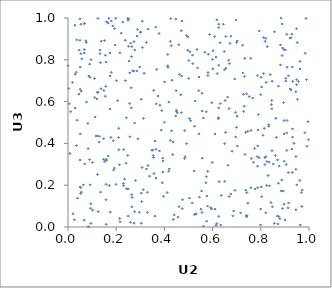
| Category | Series 0 |
|---|---|
| 0.13522444000613 | 0.167 |
| 0.7854953236132686 | 0.337 |
| 0.39144185761630057 | 0.211 |
| 0.0030037911882846435 | 0.664 |
| 0.0006992588423483381 | 0.772 |
| 0.6928218439673285 | 0.175 |
| 0.8116280989693601 | 0.907 |
| 0.5570533439098767 | 0.329 |
| 0.702722443580721 | 0.388 |
| 0.8464168371500842 | 0.365 |
| 0.8731145959814042 | 0.209 |
| 0.46050105868576596 | 0.097 |
| 0.3609877343468043 | 0.052 |
| 0.6637430186142336 | 0.295 |
| 0.1199688120044361 | 0.613 |
| 0.3796724315625547 | 0.364 |
| 0.4836005883754283 | 0.327 |
| 0.12109681325410748 | 0.436 |
| 0.19325541087583087 | 0.949 |
| 0.40074470990659805 | 0.694 |
| 0.2098115138034229 | 0.429 |
| 0.9314464640888953 | 0.469 |
| 0.30590182833435553 | 0.122 |
| 0.9040351437162205 | 0.711 |
| 0.44763936766492873 | 0.994 |
| 0.6875140807885057 | 0.076 |
| 0.5741635742791101 | 0.241 |
| 0.8222397956273461 | 0.692 |
| 0.171328026896286 | 0.198 |
| 0.9293196318778789 | 0.373 |
| 0.1349155145619143 | 0.786 |
| 0.36530642596375495 | 0.234 |
| 0.23790195415000726 | 0.894 |
| 0.25212200026847653 | 0.996 |
| 0.5798443758908589 | 0.266 |
| 0.6951840031433745 | 0.549 |
| 0.5044113145965674 | 0.519 |
| 0.1592360092771371 | 0.319 |
| 0.6759639606240546 | 0.913 |
| 0.09488207329281606 | 0.017 |
| 0.15767371093581373 | 0.131 |
| 0.7935874388112831 | 0.938 |
| 0.4178026478703567 | 0.267 |
| 0.7519551576580974 | 0.624 |
| 0.7333554290966594 | 0.807 |
| 0.3383820969892326 | 0.243 |
| 0.15204265226465674 | 0.892 |
| 0.15488302051557734 | 0.626 |
| 0.1757499536681525 | 0.071 |
| 0.1293714959015827 | 0.406 |
| 0.6235103307099706 | 0.523 |
| 0.9459014373322512 | 0.082 |
| 0.5238356277748918 | 0.268 |
| 0.2637597680489733 | 0.815 |
| 0.03521423334990137 | 0.39 |
| 0.4970654676559536 | 0.846 |
| 0.8847473076907165 | 0.173 |
| 0.23118691189806995 | 0.37 |
| 0.7694178278699199 | 0.31 |
| 0.08970082993973405 | 0.779 |
| 0.050657194036684006 | 0.321 |
| 0.21388986283033562 | 0.298 |
| 0.9518093916620322 | 0.611 |
| 0.7592072113374451 | 0.462 |
| 0.8168345488895357 | 0.299 |
| 0.0916192597671539 | 0.716 |
| 0.8478326386551936 | 0.097 |
| 0.619409901828192 | 0.734 |
| 0.46778476510446043 | 0.633 |
| 0.7609992667190348 | 0.328 |
| 0.2770071526737993 | 0.847 |
| 0.05085086431300845 | 0.446 |
| 0.15156551885196712 | 0.314 |
| 0.9484926936673921 | 0.705 |
| 0.6538824156324461 | 0.453 |
| 0.15668550616737276 | 0.673 |
| 0.633797178534416 | 0.01 |
| 0.2480532186995542 | 0.343 |
| 0.2971117360714476 | 0.765 |
| 0.625386536282283 | 0.774 |
| 0.5378776261457467 | 0.761 |
| 0.24979716889605386 | 0.182 |
| 0.5244565401779293 | 0.06 |
| 0.018469823262137197 | 0.691 |
| 0.26215881002402897 | 0.666 |
| 0.6998794230425606 | 0.882 |
| 0.05305428043056115 | 0.189 |
| 0.9090511494608593 | 0.764 |
| 0.2766044941676715 | 0.497 |
| 0.23827444743194215 | 0.7 |
| 0.516704916468129 | 0.822 |
| 0.8930575406515036 | 0.172 |
| 0.7869872466771587 | 0.188 |
| 0.6087335224024885 | 0.911 |
| 0.8240632570763873 | 0.199 |
| 0.41414093554436815 | 0.826 |
| 0.2803002887323688 | 0.223 |
| 0.6693167705677958 | 0.782 |
| 0.9318446246234737 | 0.43 |
| 0.7281287988434613 | 0.635 |
| 0.19782121869917346 | 0.998 |
| 0.8459723187522573 | 0.566 |
| 0.7418130182028247 | 0.049 |
| 0.17971278921391054 | 0.74 |
| 0.4624405466307594 | 0.731 |
| 0.8469820346900373 | 0.697 |
| 0.724636669125003 | 0.87 |
| 0.23470227509630814 | 0.229 |
| 0.3258224575851033 | 0.278 |
| 0.4701891874599856 | 0.939 |
| 0.9453580634695868 | 0.647 |
| 0.6021198923142702 | 0.843 |
| 0.8790433075222467 | 0.039 |
| 0.42531058107387953 | 0.414 |
| 0.6311084041201827 | 0.881 |
| 0.734315081193149 | 0.347 |
| 0.011396953292470924 | 0.552 |
| 0.5039792126516335 | 0.138 |
| 0.18912776371298645 | 0.272 |
| 0.9980852966514765 | 0.418 |
| 0.948058557039052 | 0.949 |
| 0.2740830115219759 | 0.887 |
| 0.15522935036928076 | 0.822 |
| 0.9873932327040216 | 0.998 |
| 0.6251059547572199 | 0.57 |
| 0.8764194119545408 | 0.291 |
| 0.4135466784617414 | 0.771 |
| 0.06376235207848313 | 0.202 |
| 0.5965068068085876 | 0.595 |
| 0.21062224396404938 | 0.472 |
| 0.0863100522165795 | 0.723 |
| 0.12535734493258033 | 0.645 |
| 0.864913011903537 | 0.429 |
| 0.6724140635478163 | 0.878 |
| 0.3158785050402053 | 0.735 |
| 0.8567110487669697 | 0.934 |
| 0.4202754938819786 | 0.278 |
| 0.9640782679359163 | 0.01 |
| 0.8010811251066147 | 0.717 |
| 0.6103089729218614 | 0.085 |
| 0.7585218561091854 | 0.187 |
| 0.8565720538029002 | 0.017 |
| 0.07665088350298577 | 0.598 |
| 0.31307695703082206 | 0.519 |
| 0.6549876327469988 | 0.912 |
| 0.9291175023001419 | 0.923 |
| 0.6760229024665522 | 0.158 |
| 0.1696478669831265 | 0.999 |
| 0.38901560897980947 | 0.556 |
| 0.35514288161696195 | 0.332 |
| 0.9055285675827982 | 0.298 |
| 0.0573115189484974 | 0.805 |
| 0.30401772626946666 | 0.018 |
| 0.052255350883639196 | 0.16 |
| 0.05039201746965427 | 0.192 |
| 0.5877787415210323 | 0.921 |
| 0.13300358280270974 | 0.829 |
| 0.8330849481242016 | 0.482 |
| 0.19926596010548725 | 0.204 |
| 0.9484080161661542 | 0.681 |
| 0.9492744130516995 | 0.202 |
| 0.41832345907855784 | 0.597 |
| 0.19577387053627382 | 0.871 |
| 0.09434743559449166 | 0.089 |
| 0.08373198943971383 | 0.001 |
| 0.8606383452871648 | 0.342 |
| 0.08351430979184893 | 0.375 |
| 0.7664899429049685 | 0.617 |
| 0.9455265063634998 | 0.276 |
| 0.0359306494147027 | 0.895 |
| 0.1746468079683855 | 0.723 |
| 0.6482165898736469 | 0.84 |
| 0.6499455263601235 | 0.399 |
| 0.5428965581479364 | 0.653 |
| 0.05544797768643184 | 0.167 |
| 0.8748864278520697 | 0.05 |
| 0.04510583244391164 | 0.636 |
| 0.9310149109164172 | 0.766 |
| 0.5563215086479281 | 0.07 |
| 0.16659762570086734 | 0.976 |
| 0.22711462922156678 | 0.981 |
| 0.4532076175882871 | 0.547 |
| 0.48407586805316083 | 0.461 |
| 0.11039465940781745 | 0.71 |
| 0.5012753897677124 | 0.796 |
| 0.25097857788996836 | 0.865 |
| 0.9143134131507091 | 0.26 |
| 0.1021379100540134 | 0.309 |
| 0.9087257221649548 | 0.51 |
| 0.22107891957166748 | 0.927 |
| 0.6973232691251771 | 0.99 |
| 0.8356856869169299 | 0.197 |
| 0.8143309311059339 | 0.472 |
| 0.5751245827179627 | 0.028 |
| 0.37344863844799925 | 0.627 |
| 0.7764960678581183 | 0.181 |
| 0.36135047697749545 | 0.411 |
| 0.20119627461752165 | 0.7 |
| 0.06717660223805089 | 0.033 |
| 0.07583013621513823 | 0.883 |
| 0.39626558140173873 | 0.147 |
| 0.03925545954576015 | 0.138 |
| 0.572396441821543 | 0.212 |
| 0.907767800407523 | 0.366 |
| 0.5084594517972016 | 0.509 |
| 0.47431312811927295 | 0.088 |
| 0.28849781495495175 | 0.945 |
| 0.8440202070011968 | 0.586 |
| 0.595771896051114 | 0.086 |
| 0.9840005739607054 | 0.831 |
| 0.49173638516026563 | 0.916 |
| 0.021002324136251138 | 0.063 |
| 0.4600479608385448 | 0.872 |
| 0.30422220934836464 | 0.162 |
| 0.3043179235707816 | 0.611 |
| 0.9251237951070787 | 0.656 |
| 0.4492378723547453 | 0.559 |
| 0.8897522400996918 | 0.089 |
| 0.4361664330995735 | 0.407 |
| 0.6099984364996964 | 0.445 |
| 0.2649832050625346 | 0.863 |
| 0.8387971299158544 | 0.729 |
| 0.08948939405355372 | 0.322 |
| 0.1490597048512542 | 0.653 |
| 0.06858770529948122 | 0.973 |
| 0.3870728463445866 | 0.463 |
| 0.6446437128582552 | 0.97 |
| 0.4857256088933296 | 0.336 |
| 0.42985569795161704 | 0.46 |
| 0.968400996676981 | 0.165 |
| 0.2534134485666314 | 0.794 |
| 0.2738541924571327 | 0.018 |
| 0.3946449784813961 | 0.316 |
| 0.627449596741269 | 0.217 |
| 0.8960246337166162 | 0.509 |
| 0.32995492656148373 | 0.07 |
| 0.8000632132993681 | 0.633 |
| 0.4467083397311632 | 0.531 |
| 0.962535284587105 | 0.756 |
| 0.22998311220989054 | 0.209 |
| 0.725648016305058 | 0.737 |
| 0.2426377153229875 | 0.183 |
| 0.049591686500372045 | 0.893 |
| 0.02964226882835197 | 0.731 |
| 0.6492343276185658 | 0.752 |
| 0.7742561074149372 | 0.376 |
| 0.29044971383503937 | 0.422 |
| 0.4311717524101396 | 0.702 |
| 0.4718391959377718 | 0.722 |
| 0.7288680018273522 | 0.553 |
| 0.6990063268992498 | 0.477 |
| 0.9513053993140548 | 0.882 |
| 0.17416763803768498 | 0.833 |
| 0.5759354133287254 | 0.148 |
| 0.43446834363225495 | 0.346 |
| 0.0858497222391329 | 0.001 |
| 0.9218453786592203 | 0.661 |
| 0.07410405185915048 | 0.891 |
| 0.8210237359528257 | 0.902 |
| 0.1254688067024471 | 0.073 |
| 0.6252535513363552 | 0.051 |
| 0.35670931574805465 | 0.256 |
| 0.6502923074107773 | 0.218 |
| 0.312865446591317 | 0.178 |
| 0.4703593218151122 | 0.547 |
| 0.8816930877669973 | 0.776 |
| 0.4727345591217038 | 0.985 |
| 0.11624818533065007 | 0.435 |
| 0.5247105730151369 | 0.482 |
| 0.55418065055595 | 0.172 |
| 0.5180121778521897 | 0.782 |
| 0.05054878790895234 | 0.765 |
| 0.7410679218053903 | 0.637 |
| 0.2478407638629071 | 0.998 |
| 0.4118785358096576 | 0.165 |
| 0.12222698482441319 | 0.251 |
| 0.5619951647736534 | 0.004 |
| 0.8208748422557391 | 0.337 |
| 0.5157654818256259 | 0.115 |
| 0.03761188822022199 | 0.511 |
| 0.06781921829223814 | 0.832 |
| 0.8524066281065183 | 0.301 |
| 0.8420683591343918 | 0.117 |
| 0.30879617079511557 | 0.859 |
| 0.36363787046000384 | 0.956 |
| 0.18806823250961657 | 0.413 |
| 0.2063540991969628 | 0.605 |
| 0.21448020959862812 | 0.041 |
| 0.5616705590531863 | 0.521 |
| 0.3086229526262093 | 0.985 |
| 0.27606922247732923 | 0.074 |
| 0.09474485084411743 | 0.111 |
| 0.6956497856194899 | 0.431 |
| 0.4975935193350829 | 0.91 |
| 0.44878662975374606 | 0.652 |
| 0.2869285292343108 | 0.913 |
| 0.3534776972919439 | 0.341 |
| 0.8331575137363186 | 0.49 |
| 0.9076719092035365 | 0.45 |
| 0.17795777062468565 | 0.429 |
| 0.9828252183349229 | 0.451 |
| 0.5006908641703165 | 0.711 |
| 0.14758699658992847 | 0.422 |
| 0.21112562793251055 | 0.37 |
| 0.9895987006895235 | 0.706 |
| 0.30140476489425894 | 0.933 |
| 0.7023297792120099 | 0.89 |
| 0.8032788063984412 | 0.67 |
| 0.26483361913570247 | 0.096 |
| 0.5804002671954569 | 0.724 |
| 0.7162118699570951 | 0.067 |
| 0.7934537095365645 | 0.331 |
| 0.42812390401864797 | 0.868 |
| 0.24204507848092582 | 0.523 |
| 0.9151395581731324 | 0.115 |
| 0.2412554697320466 | 0.305 |
| 0.6917958572579779 | 0.708 |
| 0.803914679743468 | 0.145 |
| 0.3488030120158577 | 0.367 |
| 0.8250271498022921 | 0.313 |
| 0.6250675166987496 | 0.97 |
| 0.9377434532711183 | 0.4 |
| 0.12407608429599193 | 0.998 |
| 0.36640626698706835 | 0.589 |
| 0.1664314412519643 | 0.339 |
| 0.6683651762265048 | 0.567 |
| 0.9211220451633707 | 0.904 |
| 0.9628747529892429 | 0.793 |
| 0.06727855778632696 | 0.974 |
| 0.6687637373844528 | 0.146 |
| 0.8686795226454229 | 0.052 |
| 0.26880689477890585 | 0.748 |
| 0.5561601247395963 | 0.64 |
| 0.9618261344732871 | 0.223 |
| 0.7996093274795297 | 0.086 |
| 0.8453916318791022 | 0.605 |
| 0.9130858899933243 | 0.092 |
| 0.8020348411999023 | 0.191 |
| 0.4147770751305052 | 0.764 |
| 0.7420294496214825 | 0.165 |
| 0.5058861300056023 | 0.838 |
| 0.10229143949391828 | 0.08 |
| 0.9006365503991706 | 0.033 |
| 0.35136161842839864 | 0.369 |
| 0.7462606835243102 | 0.114 |
| 0.426187741802605 | 0.997 |
| 0.06773781987578242 | 0.849 |
| 0.7858584963850874 | 0.725 |
| 0.25001748977080807 | 0.052 |
| 0.15789139416412323 | 0.204 |
| 0.8173063092728533 | 0.332 |
| 0.2599144010085096 | 0.88 |
| 0.6622264602111431 | 0.622 |
| 0.25691102906208485 | 0.432 |
| 0.787877484603855 | 0.464 |
| 0.14754125425782383 | 0.324 |
| 0.8303754130027826 | 0.246 |
| 0.36527050393772387 | 0.371 |
| 0.7373511909482754 | 0.453 |
| 0.1385538486737512 | 0.889 |
| 0.543489357876192 | 0.446 |
| 0.5276198483956818 | 0.603 |
| 0.5740676066490524 | 0.551 |
| 0.13008701003317047 | 0.434 |
| 0.09185080425801462 | 0.202 |
| 0.1109767189812857 | 0.619 |
| 0.869553131422618 | 0.321 |
| 0.8181463749964897 | 0.888 |
| 0.3780108055426389 | 0.926 |
| 0.12123865553322055 | 0.645 |
| 0.896440491077376 | 0.109 |
| 0.5924761427304791 | 0.093 |
| 0.8116781644639156 | 0.734 |
| 0.26585826316750805 | 0.141 |
| 0.0505241712899126 | 0.659 |
| 0.053286708915966985 | 0.83 |
| 0.18557505860994905 | 0.962 |
| 0.6514720318771936 | 0.605 |
| 0.6551920072424522 | 0.76 |
| 0.17990968159288712 | 0.985 |
| 0.5992917041151626 | 0.802 |
| 0.08254175492593485 | 0.495 |
| 0.9079128107302922 | 0.922 |
| 0.7459491474152717 | 0.458 |
| 0.39298859837912736 | 0.33 |
| 0.9022262892936247 | 0.847 |
| 0.33317594920856564 | 0.947 |
| 0.9249420646023049 | 0.906 |
| 0.19258166471848248 | 0.282 |
| 0.6837543608661357 | 0.053 |
| 0.49222781636456403 | 0.398 |
| 0.3002888649996188 | 0.931 |
| 0.39393024276797084 | 0.263 |
| 0.8815796152595399 | 0.871 |
| 0.5810006418318105 | 0.739 |
| 0.6316809629069253 | 0.591 |
| 0.25649523284222264 | 0.737 |
| 0.9562795994112917 | 0.696 |
| 0.6358588796561244 | 0.152 |
| 0.5825479868248743 | 0.827 |
| 0.2631859457706719 | 0.57 |
| 0.8343479947791453 | 0.31 |
| 0.8840181150404788 | 0.999 |
| 0.049973579702940474 | 0.996 |
| 0.23031915714682605 | 0.198 |
| 0.15973804106214495 | 0.982 |
| 0.8088280557866512 | 0.439 |
| 0.8624856018554299 | 0.52 |
| 0.15949173765484215 | 0.324 |
| 0.026391443626298527 | 0.035 |
| 0.9035780776731063 | 0.698 |
| 0.440998020848304 | 0.058 |
| 0.21531119459654968 | 0.833 |
| 0.7311891858484667 | 0.578 |
| 0.87295089693116 | 0.674 |
| 0.3316196939589583 | 0.294 |
| 0.45645193787516825 | 0.047 |
| 0.945771852074562 | 0.337 |
| 0.1580295366305814 | 0.789 |
| 0.3678838242598148 | 0.754 |
| 0.7866266065936914 | 0.291 |
| 0.03419227758650978 | 0.74 |
| 0.3072775624896492 | 0.285 |
| 0.09522498883793096 | 0.801 |
| 0.4367315318293672 | 0.037 |
| 0.6242690014138609 | 0.518 |
| 0.2854607644558236 | 0.747 |
| 0.7325757687885367 | 0.721 |
| 0.29574332144557847 | 0.07 |
| 0.5352435294639446 | 0.85 |
| 0.567849175237306 | 0.836 |
| 0.9148003005462074 | 0.723 |
| 0.5566900339250688 | 0.555 |
| 0.5293749352693066 | 0.061 |
| 0.8887728821637026 | 0.972 |
| 0.028984253698916107 | 0.966 |
| 0.1743285666524944 | 0.565 |
| 0.1127661183485007 | 0.526 |
| 0.888288792443772 | 0.82 |
| 0.6137530879971066 | 0.813 |
| 0.6177238150626939 | 0.991 |
| 0.7585994156316498 | 0.807 |
| 0.24896663925086182 | 0.989 |
| 0.6177743493845842 | 0.016 |
| 0.05446794099550856 | 0.65 |
| 0.04669531937617177 | 0.846 |
| 0.8968783440266778 | 0.314 |
| 0.5453377443756574 | 0.143 |
| 0.6811570632183928 | 0.363 |
| 0.9722800445988306 | 0.177 |
| 0.9704614560405395 | 0.098 |
| 0.7375497208737546 | 0.177 |
| 0.2557140455019976 | 0.591 |
| 0.9305403939657078 | 0.261 |
| 0.9918569492521456 | 0.386 |
| 0.4754413753395962 | 0.13 |
| 0.3555901129277049 | 0.654 |
| 0.5318379838667496 | 0.063 |
| 0.2721174771456534 | 0.746 |
| 0.26453174797926904 | 0.155 |
| 0.8905359191942763 | 0.856 |
| 0.894692581669676 | 0.595 |
| 0.1586126411307589 | 0.013 |
| 0.6253779466510853 | 0.954 |
| 0.25895446602439165 | 0.022 |
| 0.8207959452226105 | 0.068 |
| 0.7016284847558089 | 0.53 |
| 0.614314629720226 | 0.008 |
| 0.9320592781612775 | 0.697 |
| 0.007725124175149256 | 0.352 |
| 0.8710727837404895 | 0.015 |
| 0.8965547289453683 | 0.445 |
| 0.13733780166389054 | 0.662 |
| 0.7901679260746919 | 0.538 |
| 0.5790691303897011 | 0.1 |
| 0.7986321878974584 | 0.01 |
| 0.3999860420150615 | 0.501 |
| 0.053136210484139745 | 0.97 |
| 0.7871373421587161 | 0.388 |
| 0.13340609890816346 | 0.846 |
| 0.21639857110249272 | 0.025 |
| 0.0047756470801287865 | 0.59 |
| 0.8869595678659677 | 0.225 |
| 0.5440663574827124 | 0.718 |
| 0.3291506997643243 | 0.166 |
| 0.42465601749811444 | 0.888 |
| 0.5983195788973199 | 0.309 |
| 0.0692217339352642 | 0.302 |
| 0.8958472169303254 | 0.849 |
| 0.029527211706220413 | 0.569 |
| 0.45088962572274816 | 0.554 |
| 0.32530172041606975 | 0.883 |
| 0.66663328192581 | 0.798 |
| 0.7418404352259971 | 0.055 |
| 0.827012701995744 | 0.863 |
| 0.7391708703268625 | 0.054 |
| 0.9961664493666202 | 0.504 |
| 0.38147363055238115 | 0.582 |
| 0.6003293776048189 | 0.757 |
| 0.5514293644705102 | 0.085 |